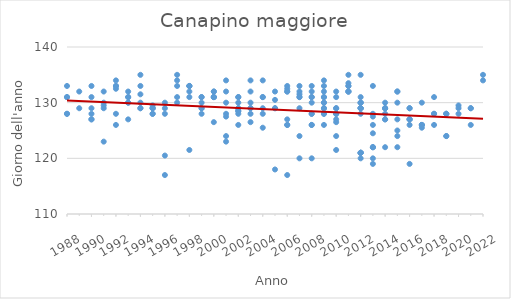
| Category | Series 0 |
|---|---|
| 1988.0 | 133 |
| 1988.0 | 131 |
| 1988.0 | 128 |
| 1988.0 | 131 |
| 1988.0 | 128 |
| 1989.0 | 129 |
| 1989.0 | 132 |
| 1990.0 | 133 |
| 1990.0 | 127 |
| 1990.0 | 127 |
| 1990.0 | 131 |
| 1990.0 | 128 |
| 1990.0 | 129 |
| 1991.0 | 123 |
| 1991.0 | 129 |
| 1991.0 | 129.5 |
| 1991.0 | 132 |
| 1991.0 | 130 |
| 1992.0 | 132.5 |
| 1992.0 | 133 |
| 1992.0 | 126 |
| 1992.0 | 128 |
| 1992.0 | 134 |
| 1992.0 | 133 |
| 1993.0 | 130 |
| 1993.0 | 127 |
| 1993.0 | 130 |
| 1993.0 | 131 |
| 1993.0 | 132 |
| 1993.0 | 131 |
| 1994.0 | 131.5 |
| 1994.0 | 129 |
| 1994.0 | 130 |
| 1994.0 | 129 |
| 1994.0 | 135 |
| 1994.0 | 133 |
| 1995.0 | 129 |
| 1995.0 | 129 |
| 1995.0 | 128 |
| 1995.0 | 128 |
| 1995.0 | 129.5 |
| 1995.0 | 129 |
| 1996.0 | 128 |
| 1996.0 | 117 |
| 1996.0 | 120.5 |
| 1996.0 | 130 |
| 1996.0 | 129 |
| 1997.0 | 130 |
| 1997.0 | 134 |
| 1997.0 | 133 |
| 1997.0 | 135 |
| 1997.0 | 131 |
| 1998.0 | 133 |
| 1998.0 | 121.5 |
| 1998.0 | 132 |
| 1998.0 | 133 |
| 1998.0 | 133 |
| 1998.0 | 131 |
| 1999.0 | 131 |
| 1999.0 | 128 |
| 1999.0 | 129 |
| 1999.0 | 129 |
| 1999.0 | 130 |
| 1999.0 | 131 |
| 2000.0 | 131 |
| 2000.0 | 131 |
| 2000.0 | 132 |
| 2000.0 | 131 |
| 2000.0 | 126.5 |
| 2000.0 | 131 |
| 2000.0 | 132 |
| 2001.0 | 130 |
| 2001.0 | 132 |
| 2001.0 | 124 |
| 2001.0 | 128 |
| 2001.0 | 127.5 |
| 2001.0 | 123 |
| 2001.0 | 134 |
| 2002.0 | 129 |
| 2002.0 | 131 |
| 2002.0 | 130 |
| 2002.0 | 128.5 |
| 2002.0 | 131 |
| 2002.0 | 128 |
| 2002.0 | 129 |
| 2002.0 | 128.5 |
| 2002.0 | 126 |
| 2003.0 | 130 |
| 2003.0 | 134 |
| 2003.0 | 126.5 |
| 2003.0 | 129 |
| 2003.0 | 132 |
| 2003.0 | 128 |
| 2003.0 | 129 |
| 2004.0 | 128 |
| 2004.0 | 134 |
| 2004.0 | 131 |
| 2004.0 | 129 |
| 2004.0 | 131 |
| 2004.0 | 125.5 |
| 2005.0 | 129 |
| 2005.0 | 132 |
| 2005.0 | 118 |
| 2005.0 | 129 |
| 2005.0 | 130.5 |
| 2006.0 | 127 |
| 2006.0 | 126 |
| 2006.0 | 117 |
| 2006.0 | 126 |
| 2006.0 | 132.5 |
| 2006.0 | 132 |
| 2006.0 | 132 |
| 2006.0 | 133 |
| 2007.0 | 129 |
| 2007.0 | 131 |
| 2007.0 | 120 |
| 2007.0 | 124 |
| 2007.0 | 131.5 |
| 2007.0 | 131 |
| 2007.0 | 132 |
| 2007.0 | 133 |
| 2008.0 | 126 |
| 2008.0 | 132 |
| 2008.0 | 120 |
| 2008.0 | 128 |
| 2008.0 | 130 |
| 2008.0 | 131 |
| 2008.0 | 131 |
| 2008.0 | 133 |
| 2008.0 | 126 |
| 2008.0 | 128 |
| 2009.0 | 128 |
| 2009.0 | 129 |
| 2009.0 | 126 |
| 2009.0 | 131 |
| 2009.0 | 130 |
| 2009.0 | 129 |
| 2009.0 | 132 |
| 2009.0 | 134 |
| 2009.0 | 131 |
| 2009.0 | 128 |
| 2009.0 | 130 |
| 2009.0 | 133 |
| 2010.0 | 124 |
| 2010.0 | 127 |
| 2010.0 | 128 |
| 2010.0 | 128 |
| 2010.0 | 132 |
| 2010.0 | 129 |
| 2010.0 | 131 |
| 2010.0 | 128 |
| 2010.0 | 129 |
| 2010.0 | 126.5 |
| 2010.0 | 121.5 |
| 2011.0 | 133 |
| 2011.0 | 133 |
| 2011.0 | 132 |
| 2011.0 | 135 |
| 2011.0 | 132 |
| 2011.0 | 132 |
| 2011.0 | 133.5 |
| 2012.0 | 130 |
| 2012.0 | 129 |
| 2012.0 | 129 |
| 2012.0 | 120 |
| 2012.0 | 121 |
| 2012.0 | 135 |
| 2012.0 | 130 |
| 2012.0 | 121 |
| 2012.0 | 129 |
| 2012.0 | 131 |
| 2012.0 | 129 |
| 2012.0 | 128 |
| 2012.0 | 121 |
| 2012.0 | 121 |
| 2012.0 | 130 |
| 2013.0 | 133 |
| 2013.0 | 127.5 |
| 2013.0 | 120 |
| 2013.0 | 122 |
| 2013.0 | 126 |
| 2013.0 | 122 |
| 2013.0 | 122 |
| 2013.0 | 128 |
| 2013.0 | 124.5 |
| 2013.0 | 119 |
| 2014.0 | 130 |
| 2014.0 | 128 |
| 2014.0 | 129 |
| 2014.0 | 129 |
| 2014.0 | 127 |
| 2014.0 | 122 |
| 2014.0 | 127 |
| 2014.0 | 129 |
| 2015.0 | 132 |
| 2015.0 | 132 |
| 2015.0 | 130 |
| 2015.0 | 122 |
| 2015.0 | 125 |
| 2015.0 | 124 |
| 2015.0 | 127 |
| 2016.0 | 126 |
| 2016.0 | 127 |
| 2016.0 | 129 |
| 2016.0 | 127 |
| 2016.0 | 119 |
| 2016.0 | 129 |
| 2016.0 | 127 |
| 2017.0 | 126 |
| 2017.0 | 126 |
| 2017.0 | 126 |
| 2017.0 | 130 |
| 2017.0 | 125.5 |
| 2018.0 | 128 |
| 2018.0 | 126 |
| 2018.0 | 128 |
| 2018.0 | 131 |
| 2019.0 | 128 |
| 2019.0 | 124 |
| 2019.0 | 128 |
| 2019.0 | 124 |
| 2019.0 | 128 |
| 2020.0 | 129 |
| 2020.0 | 128 |
| 2020.0 | 129.5 |
| 2021.0 | 129 |
| 2021.0 | 129 |
| 2021.0 | 126 |
| 2022.0 | 134 |
| 2022.0 | 135 |